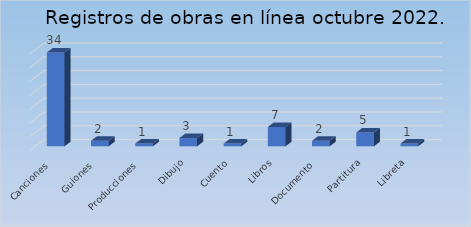
| Category | Series 0 |
|---|---|
| Canciones | 34 |
| Guiones | 2 |
| Producciones | 1 |
| Dibujo | 3 |
| Cuento | 1 |
| Libros | 7 |
| Documento | 2 |
| Partitura | 5 |
| Libreta | 1 |